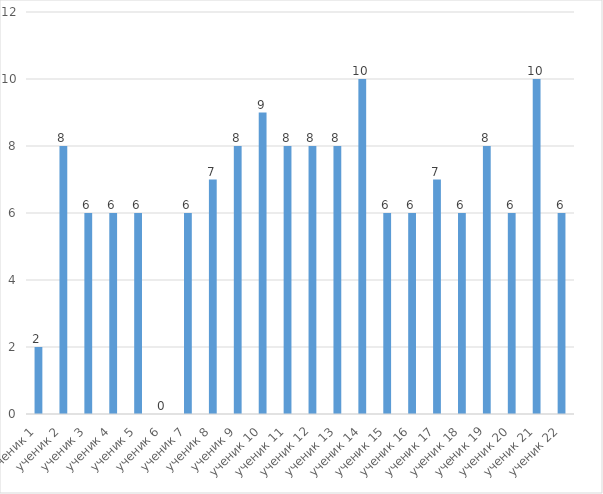
| Category | Series 0 |
|---|---|
| ученик 1 | 2 |
| ученик 2 | 8 |
| ученик 3 | 6 |
| ученик 4 | 6 |
| ученик 5 | 6 |
| ученик 6 | 0 |
| ученик 7 | 6 |
| ученик 8 | 7 |
| ученик 9 | 8 |
| ученик 10 | 9 |
| ученик 11 | 8 |
|  ученик 12 | 8 |
| ученик 13 | 8 |
| ученик 14 | 10 |
| ученик 15 | 6 |
| ученик 16 | 6 |
| ученик 17 | 7 |
| ученик 18 | 6 |
|  ученик 19 | 8 |
| ученик 20 | 6 |
| ученик 21 | 10 |
| ученик 22 | 6 |